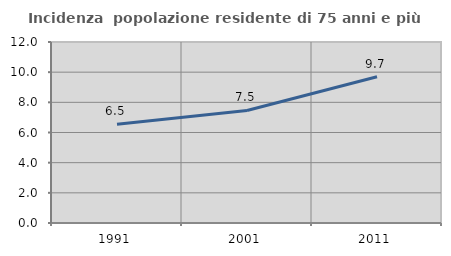
| Category | Incidenza  popolazione residente di 75 anni e più |
|---|---|
| 1991.0 | 6.546 |
| 2001.0 | 7.459 |
| 2011.0 | 9.697 |